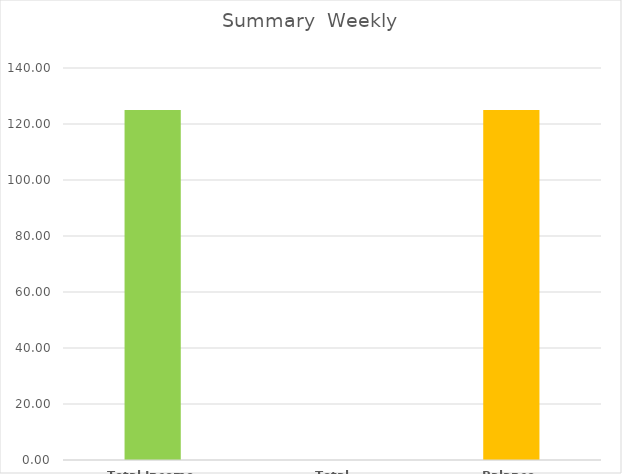
| Category | Weekly |
|---|---|
| Total Income | 125 |
| Total Expenses | 0 |
| Balance | 125 |